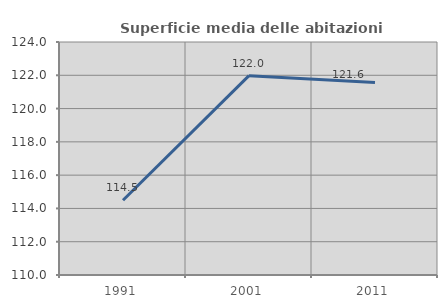
| Category | Superficie media delle abitazioni occupate |
|---|---|
| 1991.0 | 114.488 |
| 2001.0 | 121.978 |
| 2011.0 | 121.573 |